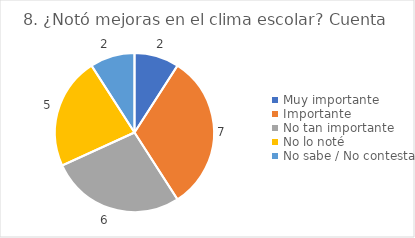
| Category | 8. ¿Notó mejoras en el clima escolar? |
|---|---|
| Muy importante  | 0.091 |
| Importante  | 0.318 |
| No tan importante  | 0.273 |
| No lo noté  | 0.227 |
| No sabe / No contesta | 0.091 |